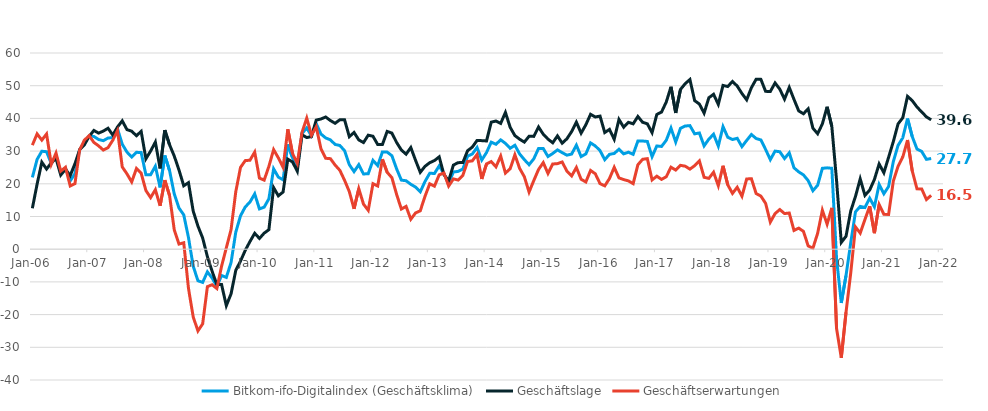
| Category | Bitkom-ifo-Digitalindex (Geschäftsklima) | Geschäftslage | Geschäftserwartungen |
|---|---|---|---|
| 2006-01-01 | 21.95 | 12.51 | 31.82 |
| 2006-02-01 | 27.45 | 19.89 | 35.27 |
| 2006-03-01 | 29.96 | 26.61 | 33.36 |
| 2006-04-01 | 29.81 | 24.52 | 35.23 |
| 2006-05-01 | 26.19 | 26.4 | 25.97 |
| 2006-06-01 | 28.57 | 27.75 | 29.4 |
| 2006-07-01 | 23.27 | 22.67 | 23.87 |
| 2006-08-01 | 24.76 | 24.47 | 25.06 |
| 2006-09-01 | 20.91 | 22.5 | 19.34 |
| 2006-10-01 | 23.08 | 26.15 | 20.04 |
| 2006-11-01 | 30.43 | 30.46 | 30.4 |
| 2006-12-01 | 32.64 | 31.94 | 33.35 |
| 2007-01-01 | 34.61 | 34.49 | 34.73 |
| 2007-02-01 | 34.48 | 36.32 | 32.66 |
| 2007-03-01 | 33.54 | 35.5 | 31.6 |
| 2007-04-01 | 33.19 | 36.12 | 30.31 |
| 2007-05-01 | 34 | 36.99 | 31.06 |
| 2007-06-01 | 34.12 | 34.9 | 33.33 |
| 2007-07-01 | 36.81 | 37.38 | 36.24 |
| 2007-08-01 | 32.1 | 39.26 | 25.16 |
| 2007-09-01 | 29.7 | 36.57 | 23.03 |
| 2007-10-01 | 28.2 | 36.09 | 20.57 |
| 2007-11-01 | 29.63 | 34.7 | 24.67 |
| 2007-12-01 | 29.55 | 36.03 | 23.25 |
| 2008-01-01 | 22.75 | 27.65 | 17.95 |
| 2008-02-01 | 22.79 | 30.02 | 15.78 |
| 2008-03-01 | 25.37 | 32.77 | 18.2 |
| 2008-04-01 | 18.91 | 24.7 | 13.27 |
| 2008-05-01 | 28.64 | 36.42 | 21.12 |
| 2008-06-01 | 24.05 | 31.95 | 16.42 |
| 2008-07-01 | 16.87 | 28.46 | 5.88 |
| 2008-08-01 | 12.58 | 24.2 | 1.57 |
| 2008-09-01 | 10.5 | 19.39 | 1.97 |
| 2008-10-01 | 3.57 | 20.36 | -11.95 |
| 2008-11-01 | -5.2 | 11.66 | -20.72 |
| 2008-12-01 | -9.64 | 7.07 | -25 |
| 2009-01-01 | -10.15 | 3.43 | -22.81 |
| 2009-02-01 | -6.93 | -2.28 | -11.46 |
| 2009-03-01 | -8.82 | -6.77 | -10.86 |
| 2009-04-01 | -11.42 | -10.82 | -12.02 |
| 2009-05-01 | -8.04 | -10.83 | -5.19 |
| 2009-06-01 | -8.62 | -17.26 | 0.42 |
| 2009-07-01 | -4.1 | -13.66 | 5.96 |
| 2009-08-01 | 5.21 | -6.46 | 17.58 |
| 2009-09-01 | 10.21 | -3.63 | 25.01 |
| 2009-10-01 | 12.92 | -0.36 | 27.09 |
| 2009-11-01 | 14.42 | 2.35 | 27.22 |
| 2009-12-01 | 16.92 | 4.87 | 29.69 |
| 2010-01-01 | 12.32 | 3.29 | 21.75 |
| 2010-02-01 | 12.86 | 4.91 | 21.12 |
| 2010-03-01 | 15.43 | 5.97 | 25.33 |
| 2010-04-01 | 24.57 | 18.83 | 30.46 |
| 2010-05-01 | 22.04 | 16.32 | 27.92 |
| 2010-06-01 | 21.22 | 17.49 | 25.01 |
| 2010-07-01 | 32.06 | 27.53 | 36.68 |
| 2010-08-01 | 27.96 | 26.68 | 29.26 |
| 2010-09-01 | 25.04 | 23.86 | 26.23 |
| 2010-10-01 | 35.37 | 35 | 35.75 |
| 2010-11-01 | 37.1 | 34.14 | 40.1 |
| 2010-12-01 | 34.65 | 34.45 | 34.86 |
| 2011-01-01 | 38.43 | 39.47 | 37.4 |
| 2011-02-01 | 35.24 | 39.82 | 30.74 |
| 2011-03-01 | 34.02 | 40.42 | 27.8 |
| 2011-04-01 | 33.45 | 39.35 | 27.69 |
| 2011-05-01 | 32.03 | 38.5 | 25.73 |
| 2011-06-01 | 31.72 | 39.58 | 24.12 |
| 2011-07-01 | 30.12 | 39.56 | 21.06 |
| 2011-08-01 | 25.85 | 34.41 | 17.61 |
| 2011-09-01 | 23.72 | 35.7 | 12.34 |
| 2011-10-01 | 25.84 | 33.43 | 18.5 |
| 2011-11-01 | 23 | 32.61 | 13.78 |
| 2011-12-01 | 23.09 | 34.87 | 11.89 |
| 2012-01-01 | 27.17 | 34.54 | 20.03 |
| 2012-02-01 | 25.58 | 32.02 | 19.33 |
| 2012-03-01 | 29.75 | 32.01 | 27.51 |
| 2012-04-01 | 29.69 | 36.02 | 23.52 |
| 2012-05-01 | 28.59 | 35.51 | 21.87 |
| 2012-06-01 | 24.56 | 32.64 | 16.76 |
| 2012-07-01 | 21.12 | 30.34 | 12.28 |
| 2012-08-01 | 20.93 | 29.06 | 13.09 |
| 2012-09-01 | 19.85 | 31.09 | 9.16 |
| 2012-10-01 | 18.99 | 27.19 | 11.09 |
| 2012-11-01 | 17.55 | 23.51 | 11.75 |
| 2012-12-01 | 20.71 | 25.35 | 16.17 |
| 2013-01-01 | 23.21 | 26.45 | 20.01 |
| 2013-02-01 | 23.17 | 27.11 | 19.29 |
| 2013-03-01 | 25.48 | 28.24 | 22.74 |
| 2013-04-01 | 23.06 | 22.81 | 23.31 |
| 2013-05-01 | 20.1 | 20.9 | 19.3 |
| 2013-06-01 | 23.6 | 25.72 | 21.5 |
| 2013-07-01 | 23.8 | 26.47 | 21.15 |
| 2013-08-01 | 24.53 | 26.49 | 22.59 |
| 2013-09-01 | 28.46 | 30.11 | 26.82 |
| 2013-10-01 | 29.11 | 31.23 | 27.01 |
| 2013-11-01 | 31.1 | 33.26 | 28.96 |
| 2013-12-01 | 27.26 | 33.2 | 21.47 |
| 2014-01-01 | 29.56 | 33.1 | 26.06 |
| 2014-02-01 | 32.74 | 38.85 | 26.79 |
| 2014-03-01 | 32.09 | 39.2 | 25.19 |
| 2014-04-01 | 33.43 | 38.48 | 28.49 |
| 2014-05-01 | 32.37 | 41.83 | 23.28 |
| 2014-06-01 | 30.86 | 37.29 | 24.6 |
| 2014-07-01 | 31.79 | 34.75 | 28.87 |
| 2014-08-01 | 29.14 | 33.64 | 24.73 |
| 2014-09-01 | 27.39 | 32.75 | 22.17 |
| 2014-10-01 | 25.84 | 34.54 | 17.47 |
| 2014-11-01 | 27.66 | 34.5 | 21.01 |
| 2014-12-01 | 30.79 | 37.38 | 24.38 |
| 2015-01-01 | 30.77 | 35.15 | 26.48 |
| 2015-02-01 | 28.34 | 33.66 | 23.15 |
| 2015-03-01 | 29.27 | 32.54 | 26.05 |
| 2015-04-01 | 30.37 | 34.65 | 26.17 |
| 2015-05-01 | 29.53 | 32.42 | 26.67 |
| 2015-06-01 | 28.75 | 33.77 | 23.85 |
| 2015-07-01 | 29.1 | 35.99 | 22.41 |
| 2015-08-01 | 31.81 | 38.84 | 24.99 |
| 2015-09-01 | 28.33 | 35.48 | 21.39 |
| 2015-10-01 | 29.14 | 38.05 | 20.56 |
| 2015-11-01 | 32.51 | 41.25 | 24.08 |
| 2015-12-01 | 31.58 | 40.43 | 23.06 |
| 2016-01-01 | 30.14 | 40.7 | 20.05 |
| 2016-02-01 | 27.38 | 35.67 | 19.37 |
| 2016-03-01 | 29.01 | 36.63 | 21.62 |
| 2016-04-01 | 29.28 | 33.61 | 25.04 |
| 2016-05-01 | 30.57 | 39.68 | 21.81 |
| 2016-06-01 | 29.16 | 37.31 | 21.29 |
| 2016-07-01 | 29.67 | 38.8 | 20.89 |
| 2016-08-01 | 29.01 | 38.34 | 20.05 |
| 2016-09-01 | 33.08 | 40.59 | 25.82 |
| 2016-10-01 | 33.08 | 38.81 | 27.49 |
| 2016-11-01 | 32.95 | 38.34 | 27.69 |
| 2016-12-01 | 28.3 | 35.64 | 21.18 |
| 2017-01-01 | 31.57 | 41.2 | 22.33 |
| 2017-02-01 | 31.42 | 41.94 | 21.35 |
| 2017-03-01 | 33.31 | 45.01 | 22.16 |
| 2017-04-01 | 37.05 | 49.67 | 25.07 |
| 2017-05-01 | 32.77 | 41.67 | 24.2 |
| 2017-06-01 | 36.96 | 48.85 | 25.64 |
| 2017-07-01 | 37.67 | 50.62 | 25.39 |
| 2017-08-01 | 37.79 | 51.89 | 24.49 |
| 2017-09-01 | 35.28 | 45.44 | 25.54 |
| 2017-10-01 | 35.54 | 44.39 | 27.01 |
| 2017-11-01 | 31.6 | 41.62 | 21.99 |
| 2017-12-01 | 33.66 | 46.31 | 21.66 |
| 2018-01-01 | 35.16 | 47.38 | 23.54 |
| 2018-02-01 | 31.53 | 44.29 | 19.43 |
| 2018-03-01 | 37.48 | 50.08 | 25.52 |
| 2018-04-01 | 34.23 | 49.75 | 19.68 |
| 2018-05-01 | 33.55 | 51.3 | 17.06 |
| 2018-06-01 | 33.91 | 49.89 | 18.94 |
| 2018-07-01 | 31.37 | 47.61 | 16.2 |
| 2018-08-01 | 33.27 | 45.69 | 21.48 |
| 2018-09-01 | 35.07 | 49.4 | 21.56 |
| 2018-10-01 | 33.85 | 51.98 | 17.02 |
| 2018-11-01 | 33.41 | 51.94 | 16.24 |
| 2018-12-01 | 30.51 | 48.27 | 14.03 |
| 2019-01-01 | 27.39 | 48.24 | 8.29 |
| 2019-02-01 | 30 | 50.84 | 10.89 |
| 2019-03-01 | 29.8 | 48.94 | 12.13 |
| 2019-04-01 | 27.73 | 45.89 | 10.9 |
| 2019-05-01 | 29.47 | 49.48 | 11.06 |
| 2019-06-01 | 24.89 | 45.82 | 5.74 |
| 2019-07-01 | 23.65 | 42.29 | 6.44 |
| 2019-08-01 | 22.72 | 41.43 | 5.46 |
| 2019-09-01 | 20.97 | 42.92 | 1.01 |
| 2019-10-01 | 17.88 | 37 | 0.3 |
| 2019-11-01 | 19.56 | 35.31 | 4.86 |
| 2019-12-01 | 24.73 | 38.31 | 11.93 |
| 2020-01-01 | 24.88 | 43.56 | 7.64 |
| 2020-02-01 | 24.74 | 37.55 | 12.63 |
| 2020-03-01 | -2.92 | 21 | -24.25 |
| 2020-04-01 | -16.43 | 2.07 | -33.23 |
| 2020-05-01 | -8.02 | 3.95 | -19.29 |
| 2020-06-01 | 2.02 | 11.71 | -7.22 |
| 2020-07-01 | 11.43 | 16.14 | 6.82 |
| 2020-08-01 | 13.06 | 21.5 | 4.94 |
| 2020-09-01 | 12.75 | 16.46 | 9.1 |
| 2020-10-01 | 15.61 | 18.08 | 13.17 |
| 2020-11-01 | 12.97 | 21.33 | 4.91 |
| 2020-12-01 | 19.77 | 26.06 | 13.65 |
| 2021-01-01 | 16.95 | 23.38 | 10.69 |
| 2021-02-01 | 19.18 | 28.11 | 10.61 |
| 2021-03-01 | 26.81 | 32.92 | 20.86 |
| 2021-04-01 | 31.74 | 38.32 | 25.33 |
| 2021-05-01 | 34.11 | 40.2 | 28.18 |
| 2021-06-01 | 39.96 | 46.74 | 33.38 |
| 2021-07-01 | 34.43 | 45.43 | 23.93 |
| 2021-08-01 | 30.64 | 43.48 | 18.48 |
| 2021-09-01 | 29.89 | 41.97 | 18.41 |
| 2021-10-01 | 27.48 | 40.46 | 15.2 |
| 2021-11-01 | 27.72 | 39.56 | 16.46 |